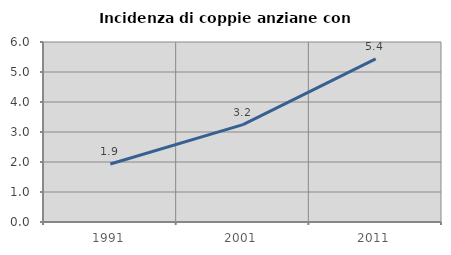
| Category | Incidenza di coppie anziane con figli |
|---|---|
| 1991.0 | 1.933 |
| 2001.0 | 3.246 |
| 2011.0 | 5.436 |